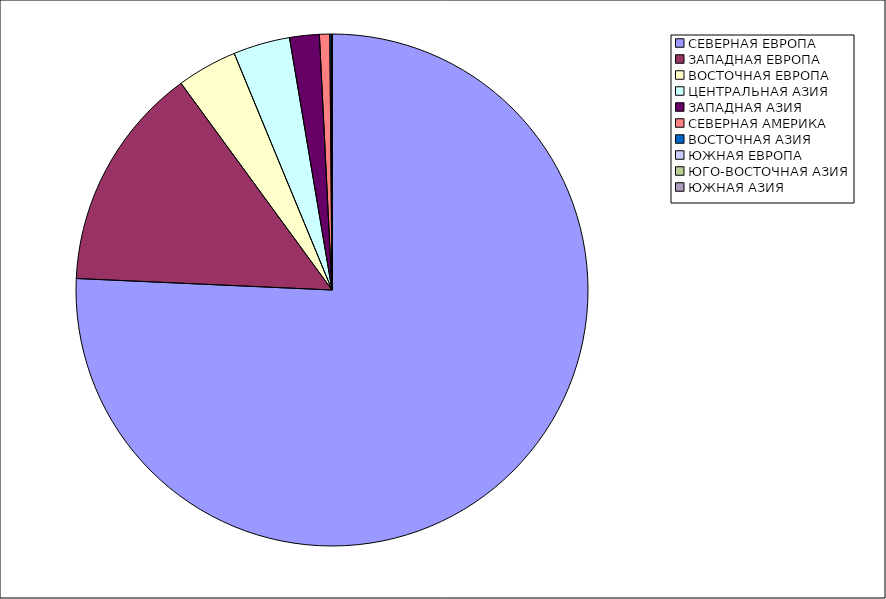
| Category | Оборот |
|---|---|
| СЕВЕРНАЯ ЕВРОПА | 75.716 |
| ЗАПАДНАЯ ЕВРОПА | 14.243 |
| ВОСТОЧНАЯ ЕВРОПА | 3.804 |
| ЦЕНТРАЛЬНАЯ АЗИЯ | 3.578 |
| ЗАПАДНАЯ АЗИЯ | 1.873 |
| СЕВЕРНАЯ АМЕРИКА | 0.651 |
| ВОСТОЧНАЯ АЗИЯ | 0.13 |
| ЮЖНАЯ ЕВРОПА | 0.003 |
| ЮГО-ВОСТОЧНАЯ АЗИЯ | 0.002 |
| ЮЖНАЯ АЗИЯ | 0 |